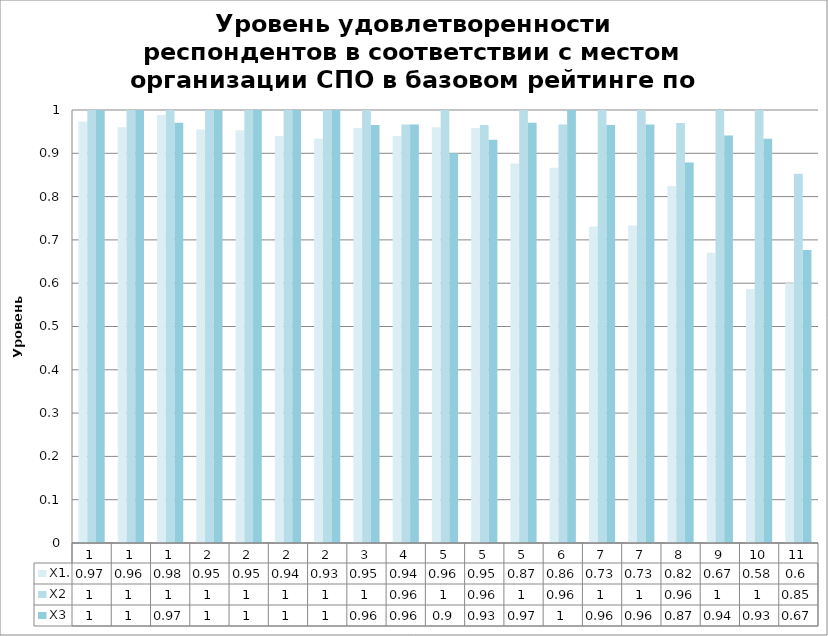
| Category | X1. | X2 | X3 |
|---|---|---|---|
| 1.0 | 0.973 | 1 | 1 |
| 1.0 | 0.96 | 1 | 1 |
| 1.0 | 0.988 | 1 | 0.971 |
| 2.0 | 0.955 | 1 | 1 |
| 2.0 | 0.953 | 1 | 1 |
| 2.0 | 0.94 | 1 | 1 |
| 2.0 | 0.933 | 1 | 1 |
| 3.0 | 0.959 | 1 | 0.966 |
| 4.0 | 0.94 | 0.967 | 0.967 |
| 5.0 | 0.96 | 1 | 0.9 |
| 5.0 | 0.959 | 0.966 | 0.931 |
| 5.0 | 0.876 | 1 | 0.971 |
| 6.0 | 0.867 | 0.967 | 1 |
| 7.0 | 0.731 | 1 | 0.966 |
| 7.0 | 0.733 | 1 | 0.967 |
| 8.0 | 0.824 | 0.97 | 0.879 |
| 9.0 | 0.671 | 1 | 0.941 |
| 10.0 | 0.587 | 1 | 0.933 |
| 11.0 | 0.6 | 0.853 | 0.676 |